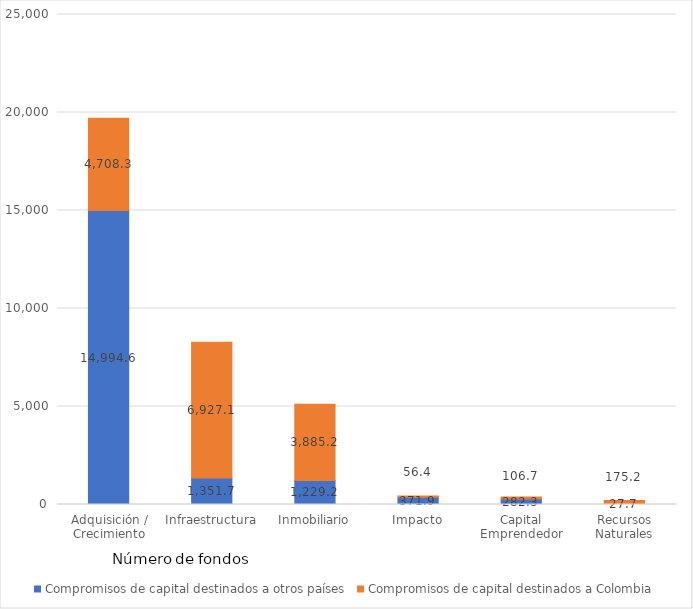
| Category | Compromisos de capital destinados a otros países | Compromisos de capital destinados a Colombia |
|---|---|---|
| Adquisición / Crecimiento | 14994.61 | 4708.261 |
| Infraestructura | 1351.709 | 6927.137 |
| Inmobiliario | 1229.178 | 3885.189 |
| Impacto | 371.855 | 56.355 |
| Capital Emprendedor | 282.301 | 106.678 |
| Recursos Naturales | 27.65 | 175.218 |